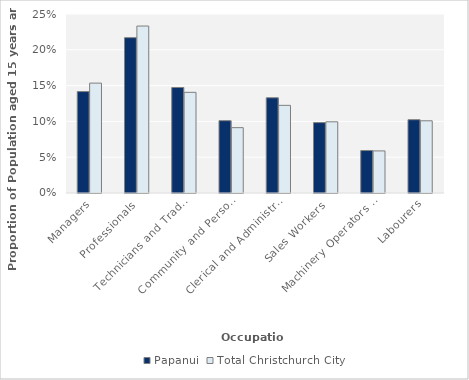
| Category | Papanui | Total Christchurch City |
|---|---|---|
| Managers | 0.142 | 0.153 |
| Professionals | 0.217 | 0.233 |
| Technicians and Trades Workers | 0.147 | 0.141 |
| Community and Personal Service Workers | 0.101 | 0.091 |
| Clerical and Administrative Workers | 0.133 | 0.122 |
| Sales Workers | 0.098 | 0.099 |
| Machinery Operators and Drivers | 0.059 | 0.059 |
| Labourers | 0.102 | 0.101 |